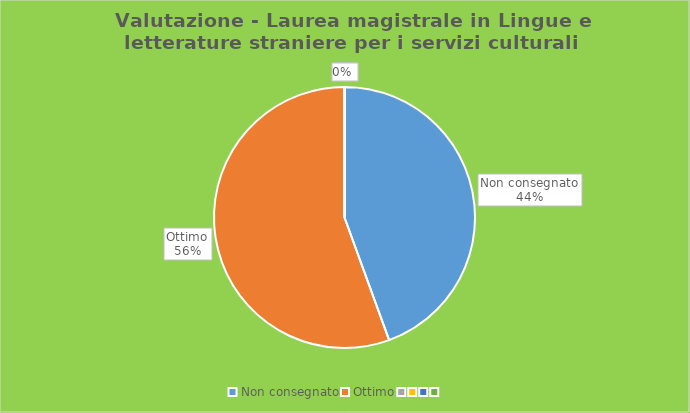
| Category | Series 0 |
|---|---|
| Non consegnato | 8 |
| Ottimo | 10 |